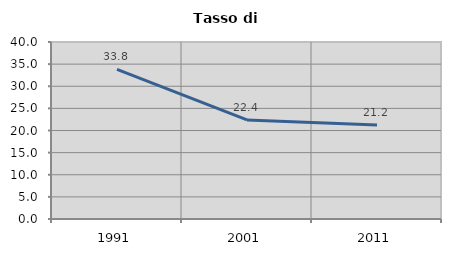
| Category | Tasso di disoccupazione   |
|---|---|
| 1991.0 | 33.792 |
| 2001.0 | 22.382 |
| 2011.0 | 21.227 |